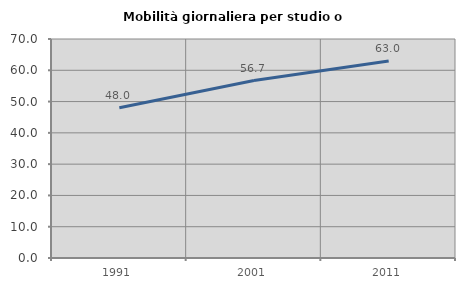
| Category | Mobilità giornaliera per studio o lavoro |
|---|---|
| 1991.0 | 48.032 |
| 2001.0 | 56.733 |
| 2011.0 | 63.002 |